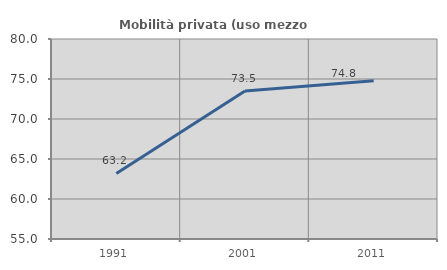
| Category | Mobilità privata (uso mezzo privato) |
|---|---|
| 1991.0 | 63.197 |
| 2001.0 | 73.492 |
| 2011.0 | 74.793 |